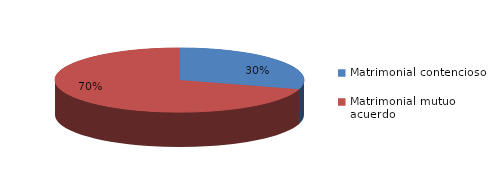
| Category | Series 0 |
|---|---|
| 0 | 104 |
| 1 | 247 |